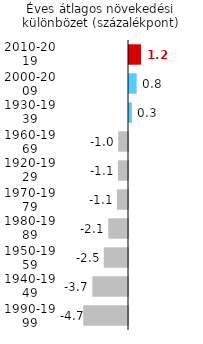
| Category | Annual average growth difference compared to Austria |
|---|---|
| 1990-1999 | -4.662 |
| 1940-1949 | -3.713 |
| 1950-1959 | -2.526 |
| 1980-1989 | -2.056 |
| 1970-1979 | -1.148 |
| 1920-1929 | -1.051 |
| 1960-1969 | -1.026 |
| 1930-1939 | 0.302 |
| 2000-2009 | 0.799 |
| 2010-2019 | 1.25 |